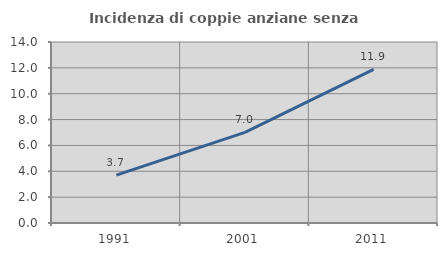
| Category | Incidenza di coppie anziane senza figli  |
|---|---|
| 1991.0 | 3.709 |
| 2001.0 | 7.011 |
| 2011.0 | 11.881 |